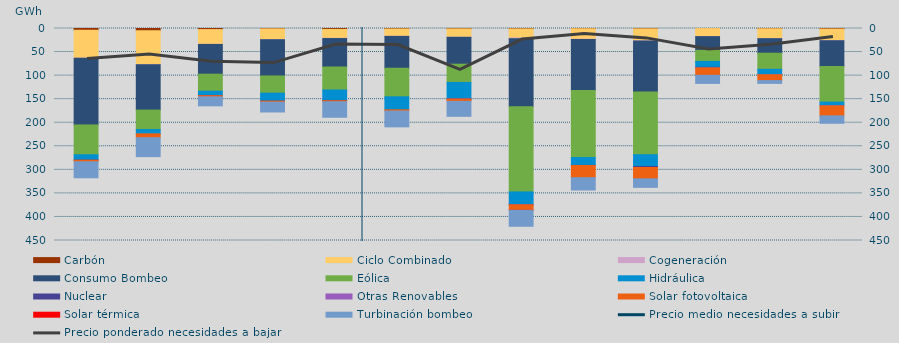
| Category | Carbón | Ciclo Combinado | Cogeneración | Consumo Bombeo | Eólica | Hidráulica | Nuclear | Otras Renovables | Solar fotovoltaica | Solar térmica | Turbinación bombeo |
|---|---|---|---|---|---|---|---|---|---|---|---|
| 0 | 3747 | 59427.025 | 92.6 | 141431.55 | 63317 | 11208.6 | 225.6 | 0 | 3390.725 | 0 | 34005.35 |
| 1 | 4777.9 | 72027.575 | 369 | 96009.825 | 41297.175 | 9161.725 | 0 | 0 | 8173.5 | 0 | 40164.95 |
| 2 | 2339.95 | 31212.45 | 309 | 63146.125 | 35992.6 | 9536.075 | 20 | 0 | 2519.6 | 0 | 19037.975 |
| 3 | 804 | 22741.325 | 259.55 | 76959.4 | 36430.1 | 16893 | 82 | 0 | 2101.325 | 0 | 20947.55 |
| 4 | 1954 | 18792.9 | 569.425 | 60395.65 | 48803.7 | 22168.6 | 540.725 | 0 | 2191.975 | 0 | 32969.35 |
| 5 | 1013 | 15498.975 | 284.05 | 67580.25 | 60658.55 | 27501.4 | 0 | 0 | 2682.825 | 0 | 33526.625 |
| 6 | 883 | 17650.875 | 181.5 | 57086.475 | 38624.325 | 35109.7 | 186 | 16 | 4912.925 | 0 | 31800.3 |
| 7 | 906 | 19278.9 | 1400.95 | 144482.175 | 180813.55 | 26734.575 | 692.75 | 22 | 11477.9 | 11 | 34001.625 |
| 8 | 552 | 22218.15 | 797.8 | 108258.5 | 142089.65 | 16666.15 | 246.5 | 0 | 25852.05 | 0 | 26149.6 |
| 9 | 807.25 | 25335.65 | 347.3 | 108093.3 | 133344.025 | 24879.7 | 2223.5 | 0 | 24040.15 | 0 | 18092.95 |
| 10 | 106 | 17047.925 | 126.5 | 29117.95 | 23568.5 | 12502.85 | 1151.275 | 77.25 | 15574.875 | 0 | 17276.575 |
| 11 | 579.2 | 20963.4 | 137.5 | 30788.55 | 34164.875 | 11525.425 | 0 | 54.75 | 12384.3 | 0 | 5908.5 |
| 12 | 1158 | 24501.45 | 317.675 | 54673.8 | 75655.3 | 7633.3 | 0 | 222.25 | 21301.725 | 0 | 15716.4 |